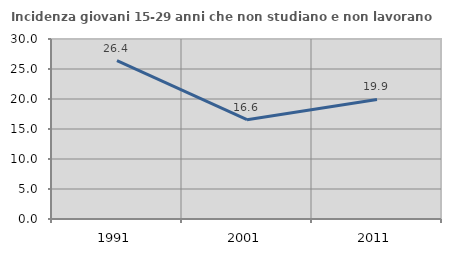
| Category | Incidenza giovani 15-29 anni che non studiano e non lavorano  |
|---|---|
| 1991.0 | 26.379 |
| 2001.0 | 16.555 |
| 2011.0 | 19.932 |